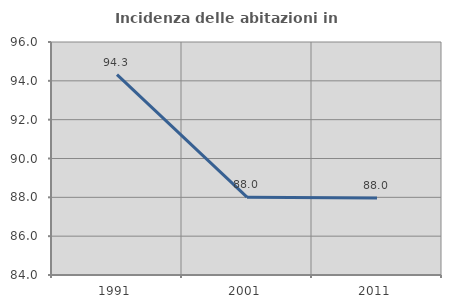
| Category | Incidenza delle abitazioni in proprietà  |
|---|---|
| 1991.0 | 94.316 |
| 2001.0 | 88.008 |
| 2011.0 | 87.964 |